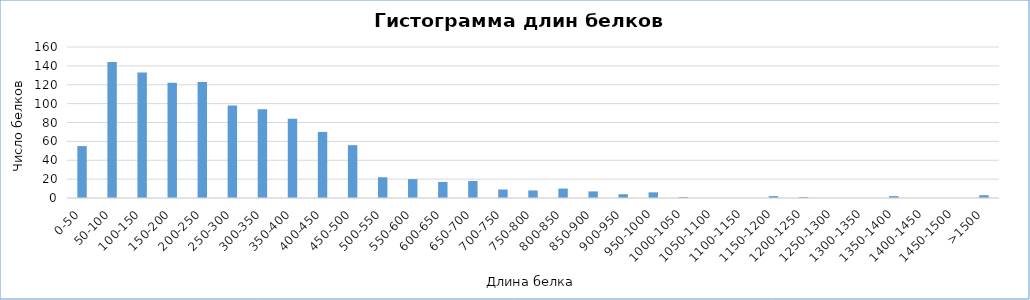
| Category | Series 0 |
|---|---|
| 0-50 | 55 |
| 50-100 | 144 |
| 100-150 | 133 |
| 150-200 | 122 |
| 200-250 | 123 |
| 250-300 | 98 |
| 300-350 | 94 |
| 350-400 | 84 |
| 400-450 | 70 |
| 450-500 | 56 |
| 500-550 | 22 |
| 550-600 | 20 |
| 600-650 | 17 |
| 650-700 | 18 |
| 700-750 | 9 |
| 750-800 | 8 |
| 800-850 | 10 |
| 850-900 | 7 |
| 900-950 | 4 |
| 950-1000 | 6 |
| 1000-1050 | 1 |
| 1050-1100 | 0 |
| 1100-1150 | 0 |
| 1150-1200 | 2 |
| 1200-1250 | 1 |
| 1250-1300 | 0 |
| 1300-1350 | 0 |
| 1350-1400 | 2 |
| 1400-1450 | 0 |
| 1450-1500 | 0 |
| >1500 | 3 |